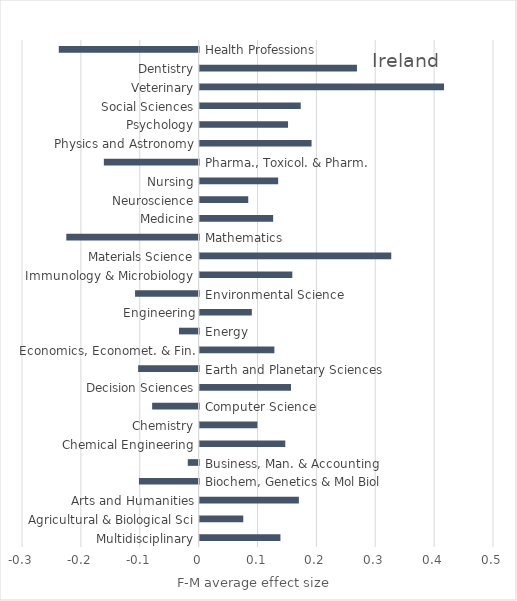
| Category | F-M average effect size | Proportion of years |
|---|---|---|
|  | 0.137 | 0 |
|  | 0.074 | 0 |
|  | 0.169 | 0 |
|  | -0.101 | 0 |
|  | -0.018 | 0 |
|  | 0.145 | 0 |
|  | 0.098 | 0 |
|  | -0.079 | 0 |
|  | 0.155 | 0 |
|  | -0.103 | 0 |
|  | 0.127 | 0 |
|  | -0.033 | 0 |
|  | 0.089 | 0 |
|  | -0.108 | 0 |
|  | 0.157 | 0 |
|  | 0.325 | 0 |
|  | -0.225 | 0 |
|  | 0.125 | 0 |
|  | 0.083 | 0 |
|  | 0.133 | 0 |
|  | -0.161 | 0 |
|  | 0.19 | 0 |
|  | 0.15 | 0 |
|  | 0.172 | 0 |
|  | 0.415 | 0 |
|  | 0.267 | 0 |
|  | -0.237 | 0 |